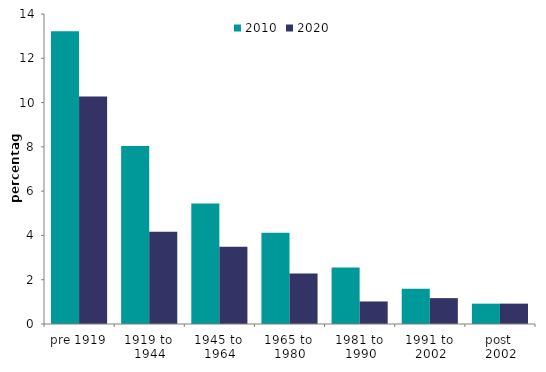
| Category | 2010 | 2020 |
|---|---|---|
| pre 1919 | 13.216 | 10.273 |
| 1919 to 
1944 | 8.044 | 4.165 |
| 1945 to 
1964 | 5.447 | 3.483 |
| 1965 to 
1980 | 4.126 | 2.281 |
| 1981 to 
1990 | 2.546 | 1.017 |
| 1991 to 
2002 | 1.588 | 1.168 |
| post 
2002 | 0.919 | 0.92 |